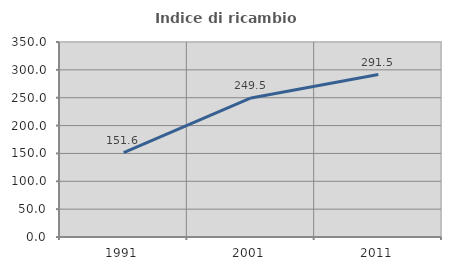
| Category | Indice di ricambio occupazionale  |
|---|---|
| 1991.0 | 151.62 |
| 2001.0 | 249.515 |
| 2011.0 | 291.489 |